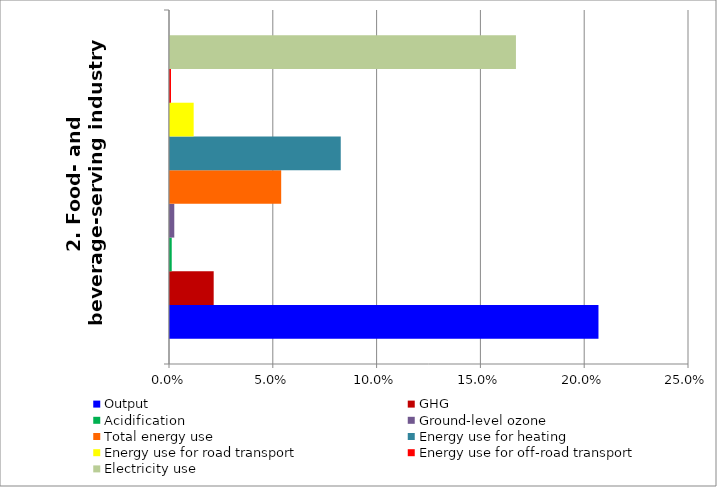
| Category | Output | GHG | Acidification | Ground-level ozone | Total energy use | Energy use for heating | Energy use for road transport | Energy use for off-road transport | Electricity use |
|---|---|---|---|---|---|---|---|---|---|
| 2. Food- and beverage-serving industry | 0.206 | 0.021 | 0.001 | 0.002 | 0.054 | 0.082 | 0.011 | 0 | 0.167 |